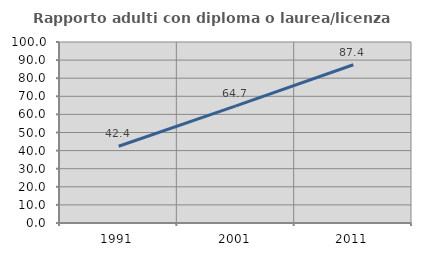
| Category | Rapporto adulti con diploma o laurea/licenza media  |
|---|---|
| 1991.0 | 42.424 |
| 2001.0 | 64.748 |
| 2011.0 | 87.417 |